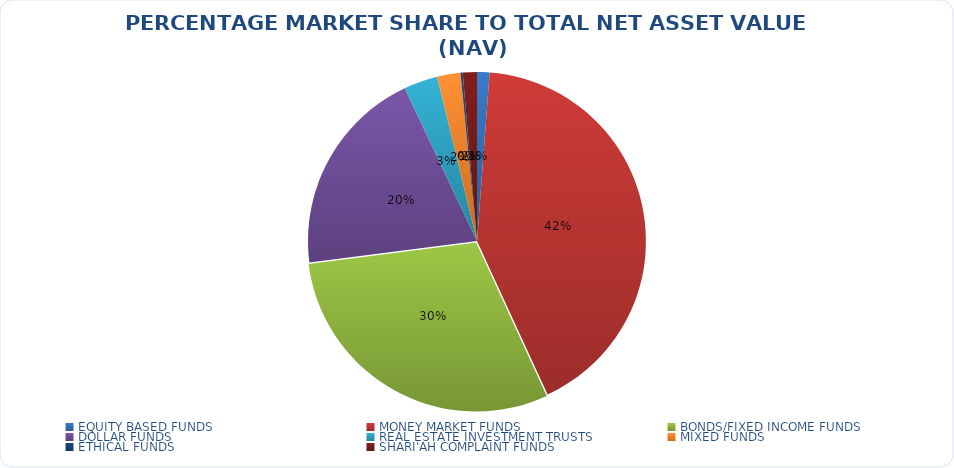
| Category | NET ASSET VALUE |
|---|---|
| EQUITY BASED FUNDS | 16679688294.98 |
| MONEY MARKET FUNDS | 586959413118.534 |
| BONDS/FIXED INCOME FUNDS | 417302626522.15 |
| DOLLAR FUNDS | 279911341896.605 |
| REAL ESTATE INVESTMENT TRUSTS | 45369481875.96 |
| MIXED FUNDS | 31195242304.964 |
| ETHICAL FUNDS | 2939002444.47 |
| SHARI'AH COMPLAINT FUNDS | 18899338421.49 |